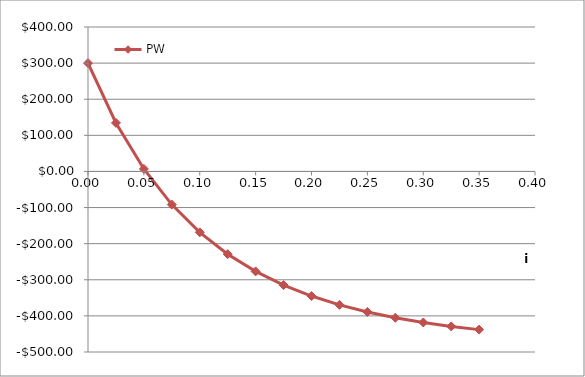
| Category | PW |
|---|---|
| 0.0 | 300 |
| 0.025 | 134.36 |
| 0.05 | 6.957 |
| 0.07500000000000001 | -91.723 |
| 0.1 | -168.674 |
| 0.125 | -229.073 |
| 0.15 | -276.783 |
| 0.175 | -314.702 |
| 0.19999999999999998 | -345.021 |
| 0.22499999999999998 | -369.407 |
| 0.24999999999999997 | -389.133 |
| 0.27499999999999997 | -405.18 |
| 0.3 | -418.308 |
| 0.325 | -429.106 |
| 0.35000000000000003 | -438.035 |